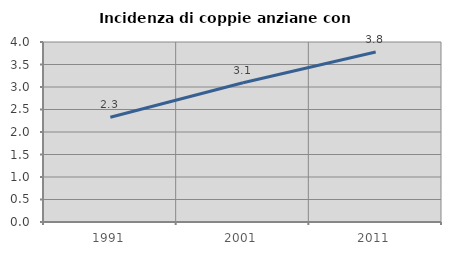
| Category | Incidenza di coppie anziane con figli |
|---|---|
| 1991.0 | 2.328 |
| 2001.0 | 3.096 |
| 2011.0 | 3.776 |